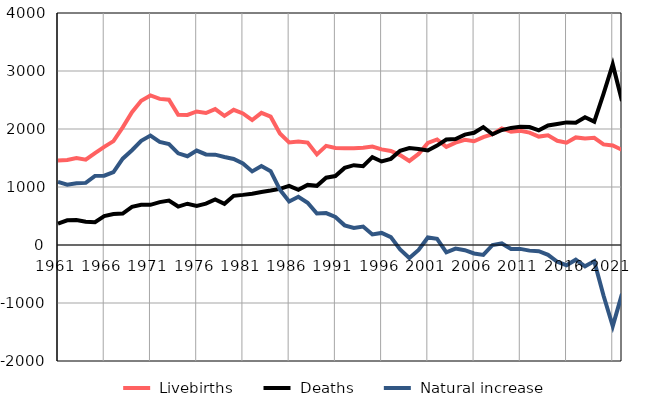
| Category |  Livebirths |  Deaths |  Natural increase |
|---|---|---|---|
| 1961.0 | 1457 | 370 | 1087 |
| 1962.0 | 1465 | 425 | 1040 |
| 1963.0 | 1498 | 432 | 1066 |
| 1964.0 | 1471 | 400 | 1071 |
| 1965.0 | 1585 | 393 | 1192 |
| 1966.0 | 1693 | 498 | 1195 |
| 1967.0 | 1791 | 534 | 1257 |
| 1968.0 | 2029 | 541 | 1488 |
| 1969.0 | 2291 | 657 | 1634 |
| 1970.0 | 2488 | 692 | 1796 |
| 1971.0 | 2578 | 692 | 1886 |
| 1972.0 | 2519 | 740 | 1779 |
| 1973.0 | 2506 | 767 | 1739 |
| 1974.0 | 2244 | 663 | 1581 |
| 1975.0 | 2242 | 712 | 1530 |
| 1976.0 | 2302 | 674 | 1628 |
| 1977.0 | 2275 | 713 | 1562 |
| 1978.0 | 2343 | 785 | 1558 |
| 1979.0 | 2227 | 710 | 1517 |
| 1980.0 | 2331 | 848 | 1483 |
| 1981.0 | 2269 | 864 | 1405 |
| 1982.0 | 2154 | 885 | 1269 |
| 1983.0 | 2278 | 915 | 1363 |
| 1984.0 | 2212 | 939 | 1273 |
| 1985.0 | 1922 | 968 | 954 |
| 1986.0 | 1769 | 1019 | 750 |
| 1987.0 | 1783 | 951 | 832 |
| 1988.0 | 1765 | 1036 | 729 |
| 1989.0 | 1562 | 1020 | 542 |
| 1990.0 | 1710 | 1160 | 550 |
| 1991.0 | 1673 | 1189 | 484 |
| 1992.0 | 1668 | 1329 | 339 |
| 1993.0 | 1669 | 1376 | 293 |
| 1994.0 | 1678 | 1360 | 318 |
| 1995.0 | 1698 | 1516 | 182 |
| 1996.0 | 1648 | 1440 | 208 |
| 1997.0 | 1622 | 1485 | 137 |
| 1998.0 | 1550 | 1625 | -75 |
| 1999.0 | 1449 | 1673 | -224 |
| 2000.0 | 1570 | 1656 | -86 |
| 2001.0 | 1760 | 1630 | 130 |
| 2002.0 | 1820 | 1713 | 107 |
| 2003.0 | 1692 | 1819 | -127 |
| 2004.0 | 1764 | 1826 | -62 |
| 2005.0 | 1813 | 1903 | -90 |
| 2006.0 | 1788 | 1934 | -146 |
| 2007.0 | 1861 | 2032 | -171 |
| 2008.0 | 1909 | 1909 | 0 |
| 2009.0 | 2009 | 1982 | 27 |
| 2010.0 | 1952 | 2019 | -67 |
| 2011.0 | 1970 | 2037 | -67 |
| 2012.0 | 1937 | 2034 | -97 |
| 2013.0 | 1869 | 1976 | -107 |
| 2014.0 | 1891 | 2060 | -169 |
| 2015.0 | 1797 | 2086 | -289 |
| 2016.0 | 1765 | 2114 | -349 |
| 2017.0 | 1855 | 2108 | -253 |
| 2018.0 | 1837 | 2204 | -367 |
| 2019.0 | 1849 | 2127 | -278 |
| 2020.0 | 1735 | 2607 | -872 |
| 2021.0 | 1715 | 3114 | -1399 |
| 2022.0 | 1640 | 2483 | -843 |